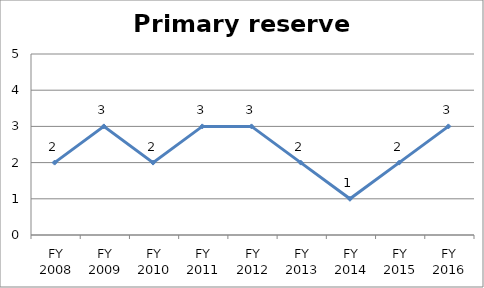
| Category | Primary reserve score |
|---|---|
| FY 2016 | 3 |
| FY 2015 | 2 |
| FY 2014 | 1 |
| FY 2013 | 2 |
| FY 2012 | 3 |
| FY 2011 | 3 |
| FY 2010 | 2 |
| FY 2009 | 3 |
| FY 2008 | 2 |